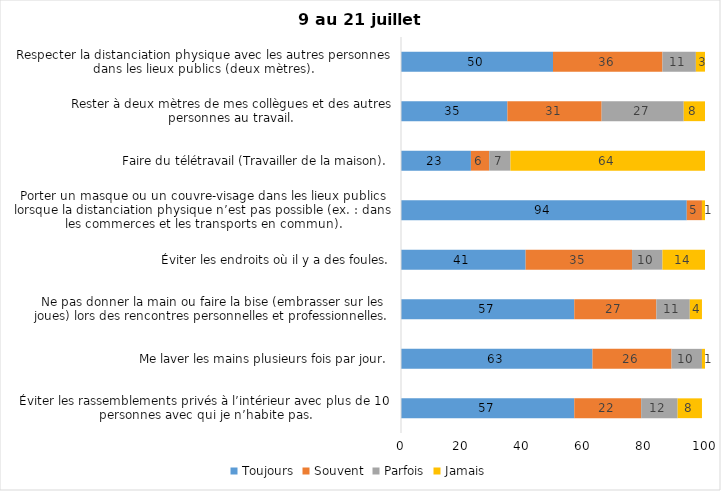
| Category | Toujours | Souvent | Parfois | Jamais |
|---|---|---|---|---|
| Éviter les rassemblements privés à l’intérieur avec plus de 10 personnes avec qui je n’habite pas. | 57 | 22 | 12 | 8 |
| Me laver les mains plusieurs fois par jour. | 63 | 26 | 10 | 1 |
| Ne pas donner la main ou faire la bise (embrasser sur les joues) lors des rencontres personnelles et professionnelles. | 57 | 27 | 11 | 4 |
| Éviter les endroits où il y a des foules. | 41 | 35 | 10 | 14 |
| Porter un masque ou un couvre-visage dans les lieux publics lorsque la distanciation physique n’est pas possible (ex. : dans les commerces et les transports en commun). | 94 | 5 | 0 | 1 |
| Faire du télétravail (Travailler de la maison). | 23 | 6 | 7 | 64 |
| Rester à deux mètres de mes collègues et des autres personnes au travail. | 35 | 31 | 27 | 8 |
| Respecter la distanciation physique avec les autres personnes dans les lieux publics (deux mètres). | 50 | 36 | 11 | 3 |